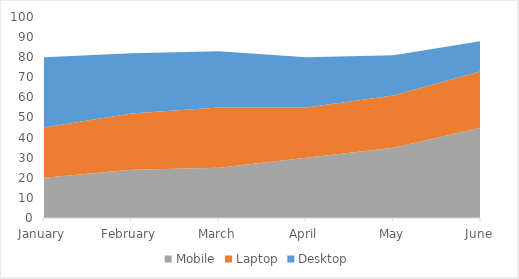
| Category | Mobile | Laptop | Desktop |
|---|---|---|---|
| January | 20 | 25 | 35 |
| February | 24 | 28 | 30 |
| March | 25 | 30 | 28 |
| April | 30 | 25 | 25 |
| May | 35 | 26 | 20 |
| June | 45 | 28 | 15 |